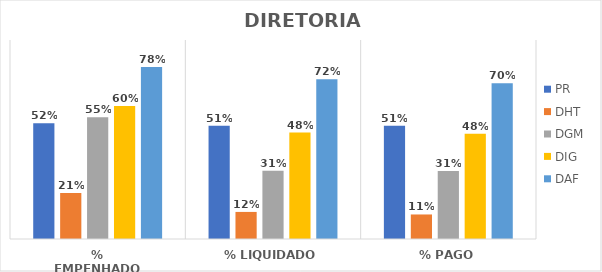
| Category | PR | DHT | DGM | DIG | DAF |
|---|---|---|---|---|---|
| % EMPENHADO | 0.523 | 0.208 | 0.55 | 0.602 | 0.778 |
| % LIQUIDADO | 0.512 | 0.122 | 0.309 | 0.482 | 0.723 |
| % PAGO | 0.512 | 0.111 | 0.307 | 0.476 | 0.704 |